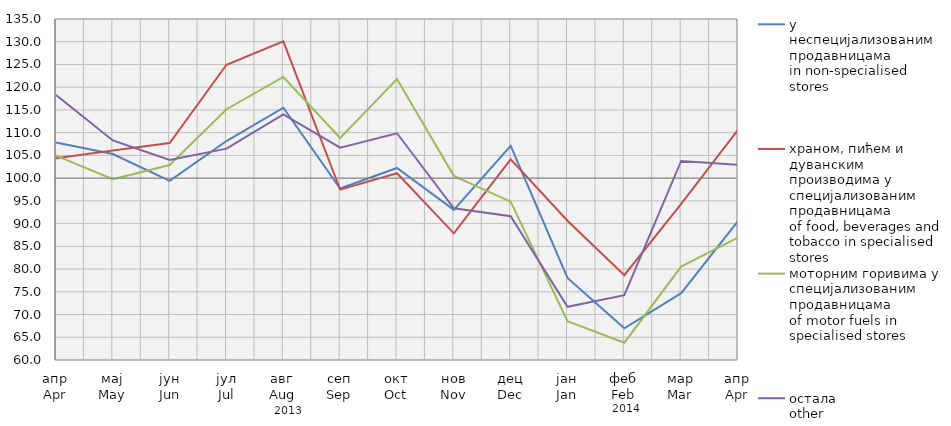
| Category | у неспецијализованим продавницама
in non-specialised stores | храном, пићем и дуванским производима у специјализовaним продавницама
of food, beverages and tobacco in specialised stores | моторним горивима у специјализованим продавницама
of motor fuels in specialised stores | остала
other |
|---|---|---|---|---|
| апр
Apr | 107.82 | 104.374 | 104.963 | 118.299 |
| мај
May | 105.292 | 106.059 | 99.786 | 108.286 |
| јун
Jun | 99.408 | 107.704 | 102.888 | 103.986 |
| јул
Jul | 108.16 | 124.929 | 115.152 | 106.482 |
| авг
Aug | 115.48 | 130.093 | 122.253 | 113.997 |
| сеп
Sep | 97.717 | 97.467 | 108.827 | 106.7 |
| окт
Oct | 102.24 | 101.077 | 121.799 | 109.868 |
| нов
Nov | 93.024 | 87.862 | 100.498 | 93.38 |
| дец
Dec | 107.124 | 104.135 | 94.83 | 91.634 |
| јан
Jan | 78.06 | 90.633 | 68.559 | 71.709 |
| феб
Feb | 66.985 | 78.662 | 63.807 | 74.254 |
| мар
Mar | 74.689 | 94.336 | 80.553 | 103.781 |
| апр
Apr | 90.551 | 110.647 | 86.935 | 102.941 |